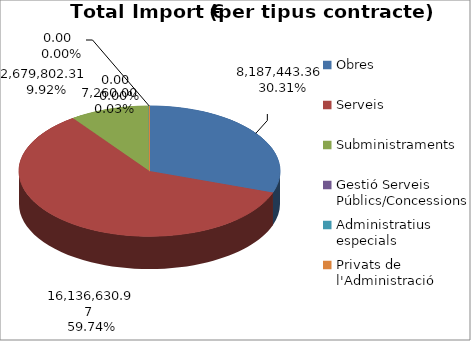
| Category | TOTALS per tipus contracte Total Import (€) | TOTALS per tipus contracte % total import | Tipus de contracte | TOTALS per tipus contracte Nombre Total Contractes | TOTALS per tipus contracte % total contractes |
|---|---|---|---|---|---|
| Obres | 8187443.36 | 0.303 |  | 118 | 0.133 |
| Serveis | 16136630.97 | 0.597 |  | 585 | 0.661 |
| Subministraments | 2679802.31 | 0.099 |  | 181 | 0.205 |
| Gestió Serveis Públics/Concessions | 0 | 0 |  | 0 | 0 |
| Administratius especials | 0 | 0 |  | 0 | 0 |
| Privats de l'Administració | 7260 | 0 |  | 1 | 0.001 |